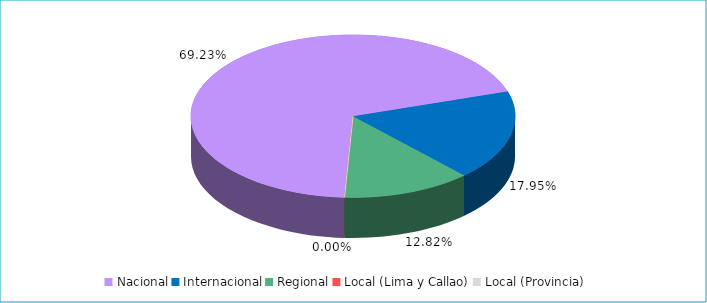
| Category | Series 0 |
|---|---|
| Nacional | 0.692 |
| Internacional | 0.179 |
| Regional | 0.128 |
| Local (Lima y Callao) | 0 |
| Local (Provincia) | 0 |